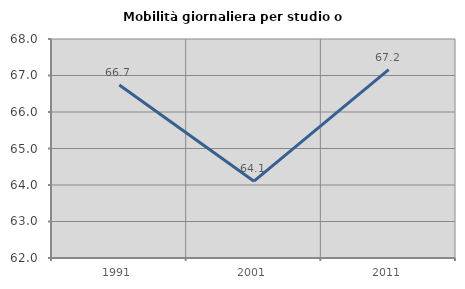
| Category | Mobilità giornaliera per studio o lavoro |
|---|---|
| 1991.0 | 66.741 |
| 2001.0 | 64.105 |
| 2011.0 | 67.159 |